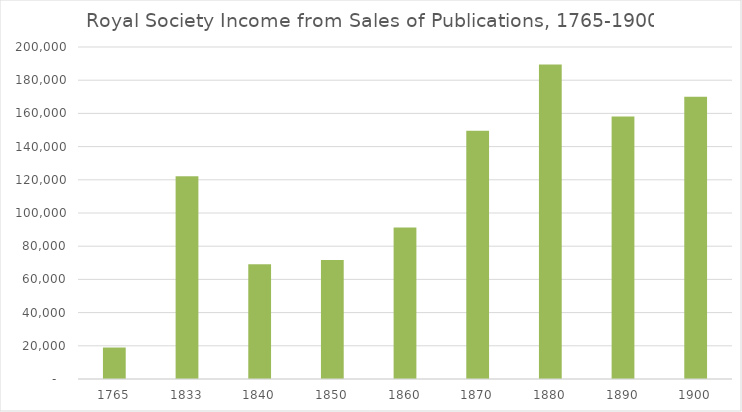
| Category | Publication Sales |
|---|---|
| 1765.0 | 18960 |
| 1833.0 | 122130 |
| 1840.0 | 69108 |
| 1850.0 | 71631 |
| 1860.0 | 91296 |
| 1870.0 | 149508 |
| 1880.0 | 189498 |
| 1890.0 | 158202 |
| 1900.0 | 169992 |